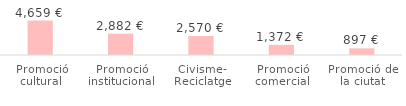
| Category | Total |
|---|---|
| Promoció cultural | 4659.17 |
| Promoció institucional | 2881.65 |
| Civisme- Reciclatge | 2569.92 |
| Promoció comercial | 1372.16 |
| Promoció de la ciutat | 896.614 |